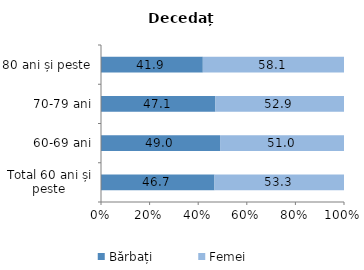
| Category | Bărbați | Femei |
|---|---|---|
| Total 60 ani și peste | 46.7 | 53.3 |
| 60-69 ani | 49 | 51 |
| 70-79 ani | 47.1 | 52.9 |
| 80 ani și peste | 41.9 | 58.1 |